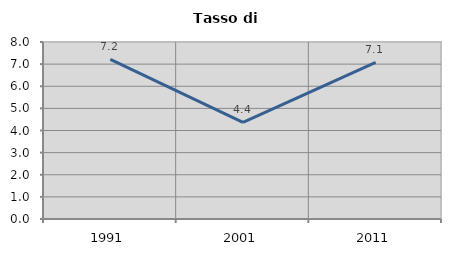
| Category | Tasso di disoccupazione   |
|---|---|
| 1991.0 | 7.212 |
| 2001.0 | 4.368 |
| 2011.0 | 7.077 |